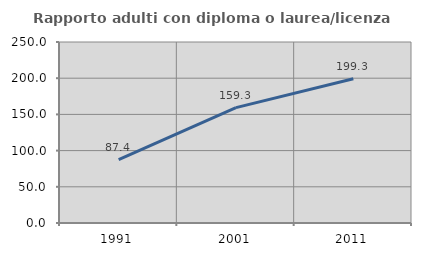
| Category | Rapporto adulti con diploma o laurea/licenza media  |
|---|---|
| 1991.0 | 87.417 |
| 2001.0 | 159.333 |
| 2011.0 | 199.301 |